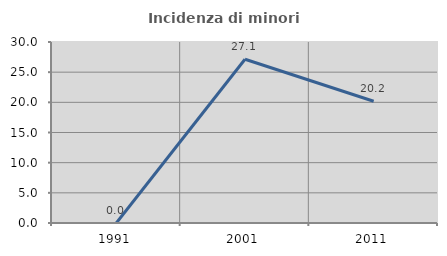
| Category | Incidenza di minori stranieri |
|---|---|
| 1991.0 | 0 |
| 2001.0 | 27.143 |
| 2011.0 | 20.183 |